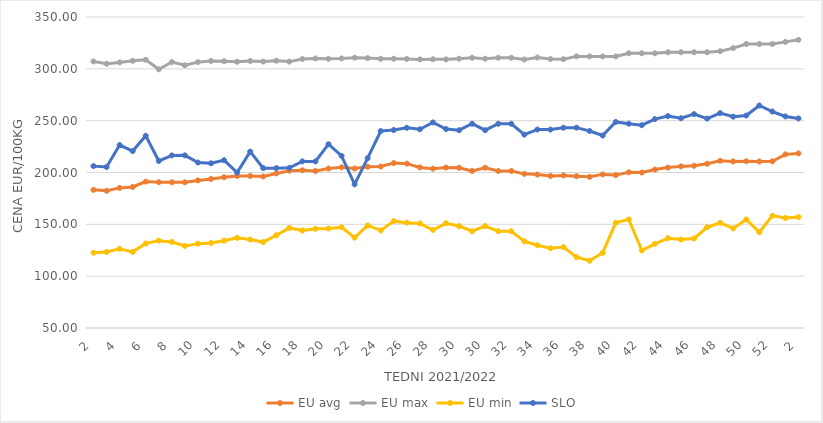
| Category | EU avg | EU max | EU min | SLO |
|---|---|---|---|---|
| 2.0 | 183.25 | 307.1 | 122.609 | 206.15 |
| 3.0 | 182.393 | 304.91 | 123.32 | 205.35 |
| 4.0 | 185.158 | 306.22 | 126.329 | 226.48 |
| 5.0 | 186.04 | 307.79 | 123.461 | 220.65 |
| 6.0 | 191.206 | 308.7 | 131.528 | 235.46 |
| 7.0 | 190.629 | 299.55 | 134.262 | 211.1 |
| 8.0 | 190.57 | 306.55 | 132.97 | 216.51 |
| 9.0 | 190.562 | 303.4 | 129.173 | 216.54 |
| 10.0 | 192.373 | 306.48 | 131.374 | 209.61 |
| 11.0 | 193.79 | 307.58 | 132.024 | 208.91 |
| 12.0 | 195.449 | 307.33 | 134.212 | 211.87 |
| 13.0 | 196.631 | 306.85 | 136.936 | 199.93 |
| 14.0 | 196.702 | 307.56 | 135.297 | 220.15 |
| 15.0 | 196.13 | 306.96 | 132.893 | 204.2 |
| 16.0 | 199.1 | 307.87 | 139.462 | 204.2 |
| 17.0 | 201.754 | 306.98 | 146.538 | 204.51 |
| 18.0 | 202.13 | 309.49 | 144.017 | 210.72 |
| 19.0 | 201.439 | 310.06 | 145.644 | 210.68 |
| 20.0 | 203.834 | 309.69 | 145.911 | 227.32 |
| 21.0 | 205.04 | 309.99 | 147.188 | 216.08 |
| 22.0 | 203.79 | 310.76 | 137.177 | 188.6 |
| 23.0 | 205.51 | 310.41 | 148.928 | 213.84 |
| 24.0 | 205.73 | 309.64 | 144.161 | 239.99 |
| 25.0 | 209.095 | 309.74 | 153.081 | 240.99 |
| 26.0 | 208.551 | 309.55 | 151.599 | 243.11 |
| 27.0 | 204.914 | 309.08 | 150.789 | 241.72 |
| 28.0 | 203.681 | 309.21 | 144.56 | 248.33 |
| 29.0 | 204.773 | 309.15 | 151.052 | 241.96 |
| 30.0 | 204.558 | 309.78 | 148.33 | 240.79 |
| 31.0 | 201.483 | 310.67 | 143.33 | 247 |
| 30.0 | 204.558 | 309.78 | 148.33 | 240.79 |
| 31.0 | 201.483 | 310.67 | 143.33 | 247 |
| 32.0 | 201.483 | 310.67 | 143.33 | 247 |
| 33.0 | 198.691 | 309 | 133.607 | 236.54 |
| 34.0 | 198.027 | 310.9 | 129.797 | 241.45 |
| 35.0 | 196.72 | 309.41 | 126.926 | 241.39 |
| 36.0 | 197.157 | 309.28 | 128.099 | 243.19 |
| 37.0 | 196.375 | 312 | 118.364 | 243.28 |
| 38.0 | 195.821 | 312 | 114.892 | 240.06 |
| 39.0 | 198.179 | 312 | 122.517 | 235.66 |
| 40.0 | 197.482 | 312 | 151.488 | 248.77 |
| 41.0 | 200.22 | 315 | 154.74 | 247.07 |
| 42.0 | 199.965 | 315 | 124.748 | 245.64 |
| 43.0 | 202.804 | 315 | 131.104 | 251.53 |
| 44.0 | 204.713 | 316 | 136.6 | 254.42 |
| 45.0 | 205.906 | 316 | 135.362 | 252.35 |
| 46.0 | 206.476 | 316 | 136.39 | 256.33 |
| 47.0 | 208.415 | 316 | 147.192 | 252.01 |
| 48.0 | 211.314 | 317 | 151.41 | 257.25 |
| 49.0 | 210.677 | 320 | 146.064 | 253.87 |
| 50.0 | 210.823 | 324 | 154.698 | 254.94 |
| 51.0 | 210.59 | 324 | 142.382 | 264.65 |
| 52.0 | 210.763 | 324 | 158.333 | 258.8 |
| 1.0 | 217.49 | 326 | 156.222 | 254.09 |
| 2.0 | 218.429 | 328 | 156.969 | 252.15 |